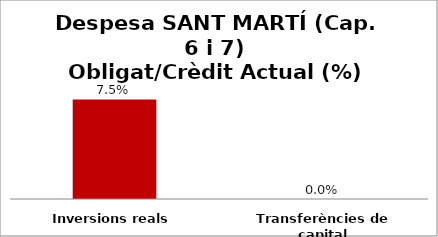
| Category | Series 0 |
|---|---|
| Inversions reals | 0.075 |
| Transferències de capital | 0 |